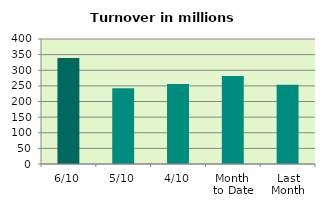
| Category | Series 0 |
|---|---|
| 6/10 | 339.13 |
| 5/10 | 242.426 |
| 4/10 | 255.669 |
| Month 
to Date | 281.442 |
| Last
Month | 253.961 |